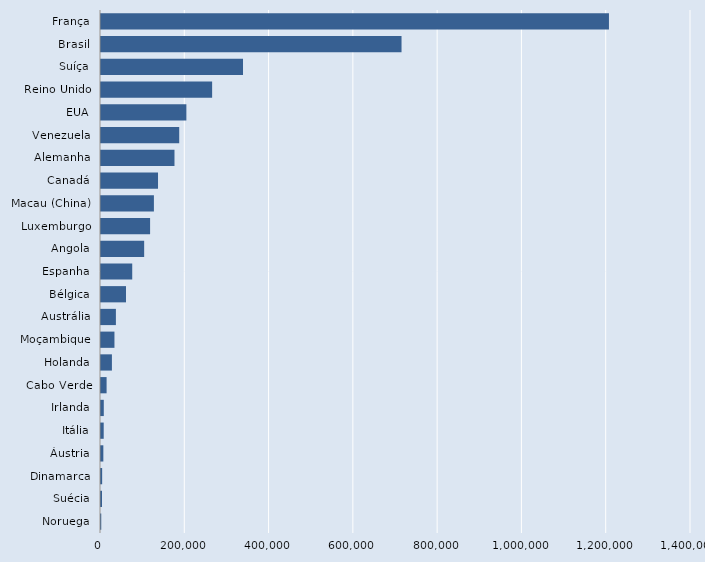
| Category | Series 0 |
|---|---|
| Noruega | 609 |
| Suécia | 2394 |
| Dinamarca | 2737 |
| Áustria | 5568 |
| Itália | 6411 |
| Irlanda | 6609 |
| Cabo Verde | 13286 |
| Holanda | 25893 |
| Moçambique | 31926 |
| Austrália | 35360 |
| Bélgica | 59336 |
| Espanha | 74112 |
| Angola | 102420 |
| Luxemburgo | 116505 |
| Macau (China) | 125549 |
| Canadá | 135301 |
| Alemanha | 174363 |
| Venezuela | 185600 |
| EUA | 202583 |
| Reino Unido | 263706 |
| Suíça | 336975 |
| Brasil | 713130 |
| França | 1205308 |